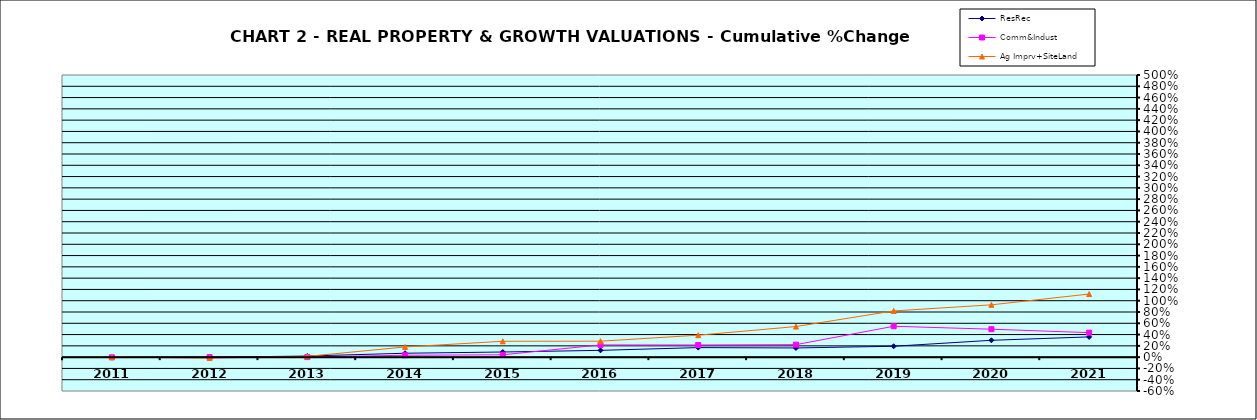
| Category | ResRec | Comm&Indust | Ag Imprv+SiteLand |
|---|---|---|---|
| 2011.0 | -0.008 | -0.003 | 0 |
| 2012.0 | -0.002 | 0 | -0.016 |
| 2013.0 | 0.02 | 0.001 | 0.014 |
| 2014.0 | 0.069 | 0.034 | 0.181 |
| 2015.0 | 0.091 | 0.042 | 0.281 |
| 2016.0 | 0.12 | 0.216 | 0.283 |
| 2017.0 | 0.169 | 0.216 | 0.389 |
| 2018.0 | 0.163 | 0.221 | 0.542 |
| 2019.0 | 0.193 | 0.547 | 0.819 |
| 2020.0 | 0.298 | 0.495 | 0.927 |
| 2021.0 | 0.359 | 0.434 | 1.119 |